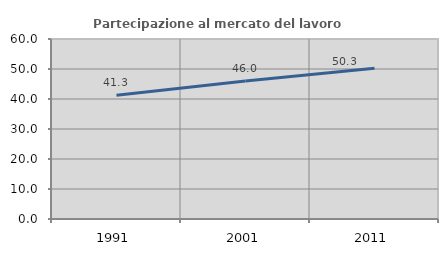
| Category | Partecipazione al mercato del lavoro  femminile |
|---|---|
| 1991.0 | 41.274 |
| 2001.0 | 45.986 |
| 2011.0 | 50.287 |